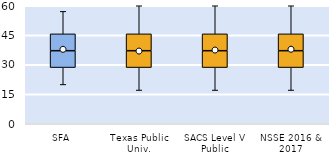
| Category | 25th | 50th | 75th |
|---|---|---|---|
| SFA | 28.571 | 8.571 | 8.571 |
| Texas Public Univ. | 28.571 | 8.571 | 8.571 |
| SACS Level V Public | 28.571 | 8.571 | 8.571 |
| NSSE 2016 & 2017 | 28.571 | 8.571 | 8.571 |